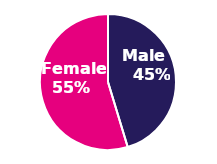
| Category | Series 0 |
|---|---|
| 0 | 126472 |
| 1 | 152595 |